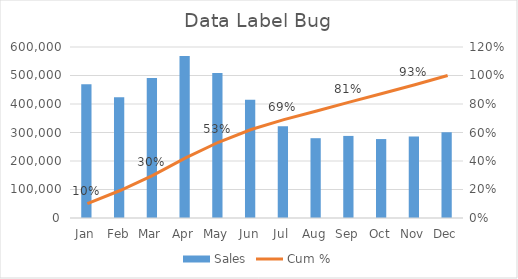
| Category | Sales |
|---|---|
| Jan | 469000 |
| Feb | 424000 |
| Mar | 491000 |
| Apr | 568000 |
| May | 509000 |
| Jun | 415000 |
| Jul | 322000 |
| Aug | 280000 |
| Sep | 288000 |
| Oct | 277000 |
| Nov | 286000 |
| Dec | 301000 |